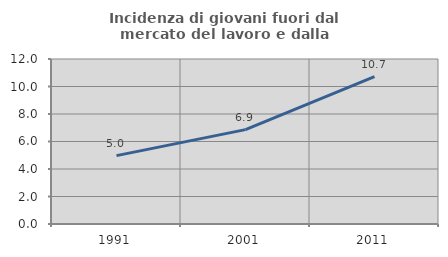
| Category | Incidenza di giovani fuori dal mercato del lavoro e dalla formazione  |
|---|---|
| 1991.0 | 4.972 |
| 2001.0 | 6.862 |
| 2011.0 | 10.71 |